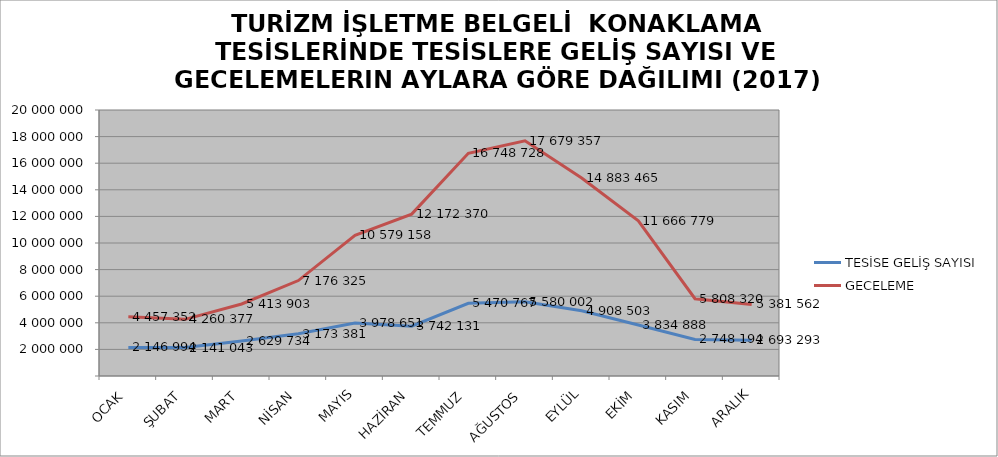
| Category | TESİSE GELİŞ SAYISI | GECELEME |
|---|---|---|
| OCAK | 2146994 | 4457352 |
| ŞUBAT | 2141043 | 4260377 |
| MART | 2629734 | 5413903 |
| NİSAN | 3173381 | 7176325 |
| MAYIS | 3978651 | 10579158 |
| HAZİRAN | 3742131 | 12172370 |
| TEMMUZ | 5470767 | 16748728 |
| AĞUSTOS | 5580002 | 17679357 |
| EYLÜL | 4908503 | 14883465 |
| EKİM | 3834888 | 11666779 |
| KASIM | 2748194 | 5808320 |
| ARALIK | 2693293 | 5381562 |